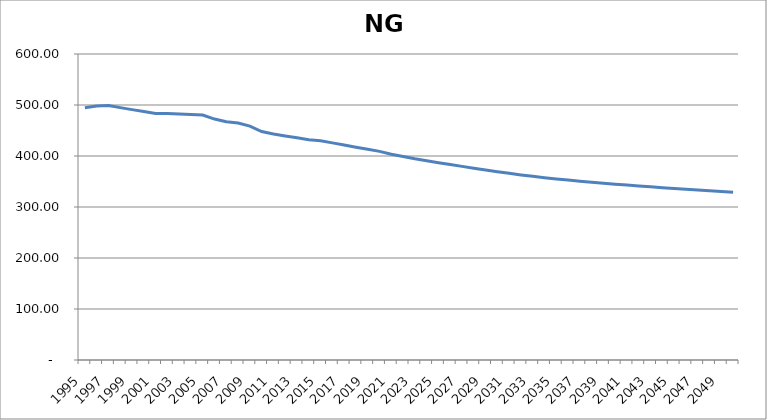
| Category | NGHeating |
|---|---|
| 1995.0 | 494.578 |
| 1996.0 | 497.86 |
| 1997.0 | 499.06 |
| 1998.0 | 494.866 |
| 1999.0 | 490.928 |
| 2000.0 | 487.053 |
| 2001.0 | 483.181 |
| 2002.0 | 483.181 |
| 2003.0 | 482.17 |
| 2004.0 | 481.195 |
| 2005.0 | 480.355 |
| 2006.0 | 472.399 |
| 2007.0 | 467.085 |
| 2008.0 | 464.655 |
| 2009.0 | 458.529 |
| 2010.0 | 448.008 |
| 2011.0 | 443.26 |
| 2012.0 | 439.37 |
| 2013.0 | 435.884 |
| 2014.0 | 431.851 |
| 2015.0 | 429.702 |
| 2016.0 | 425.7 |
| 2017.0 | 421.496 |
| 2018.0 | 417.071 |
| 2019.0 | 413.149 |
| 2020.0 | 409.121 |
| 2021.0 | 403.606 |
| 2022.0 | 399 |
| 2023.0 | 394.424 |
| 2024.0 | 390.604 |
| 2025.0 | 386.957 |
| 2026.0 | 383.244 |
| 2027.0 | 379.648 |
| 2028.0 | 376.085 |
| 2029.0 | 372.561 |
| 2030.0 | 369.22 |
| 2031.0 | 365.965 |
| 2032.0 | 362.96 |
| 2033.0 | 360.084 |
| 2034.0 | 357.425 |
| 2035.0 | 354.978 |
| 2036.0 | 352.721 |
| 2037.0 | 350.532 |
| 2038.0 | 348.487 |
| 2039.0 | 346.542 |
| 2040.0 | 344.69 |
| 2041.0 | 342.928 |
| 2042.0 | 341.249 |
| 2043.0 | 339.571 |
| 2044.0 | 337.957 |
| 2045.0 | 336.39 |
| 2046.0 | 334.814 |
| 2047.0 | 333.263 |
| 2048.0 | 331.755 |
| 2049.0 | 330.261 |
| 2050.0 | 328.819 |